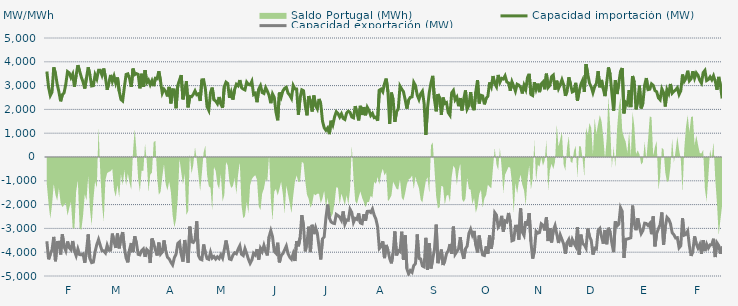
| Category | Capacidad importación (MW) | Capacidad exportación (MW) |
|---|---|---|
| 0 | 3592.5 | -3540 |
| 1900-01-01 | 2925 | -4297.5 |
| 1900-01-02 | 2582.625 | -4080.542 |
| 1900-01-03 | 2730 | -3900.625 |
| 1900-01-04 | 3769.167 | -3357.25 |
| 1900-01-05 | 3498.625 | -4380 |
| 1900-01-06 | 3058.125 | -3591.583 |
| 1900-01-07 | 2735.625 | -3581.875 |
| 1900-01-08 | 2339.792 | -4096.875 |
| 1900-01-09 | 2622.625 | -3250.667 |
| 1900-01-10 | 2697.5 | -3770.625 |
| 1900-01-11 | 3064.167 | -3943.625 |
| 1900-01-12 | 3588.75 | -3549.375 |
| 1900-01-13 | 3535.75 | -3810 |
| 1900-01-14 | 3333.958 | -3898.125 |
| 1900-01-15 | 3486.625 | -3530.542 |
| 1900-01-16 | 2951.375 | -3943.125 |
| 1900-01-17 | 3439.375 | -4149.375 |
| 1900-01-18 | 3860.625 | -3864.375 |
| 1900-01-19 | 3609.583 | -4100.625 |
| 1900-01-20 | 3359.75 | -4110 |
| 1900-01-21 | 3152.25 | -4073.75 |
| 1900-01-22 | 2876.25 | -4441.875 |
| 1900-01-23 | 3331.25 | -3948.75 |
| 1900-01-24 | 3768.75 | -3251.25 |
| 1900-01-25 | 3435.667 | -4269.375 |
| 1900-01-26 | 2984.167 | -4438.125 |
| 1900-01-27 | 2998.583 | -4415.625 |
| 1900-01-28 | 3457.333 | -3980.625 |
| 1900-01-29 | 3283.042 | -3676.875 |
| 1900-01-30 | 3641.25 | -3464.5 |
| 1900-01-31 | 3640.708 | -3708.75 |
| 1900-02-01 | 3435.708 | -3937.5 |
| 1900-02-02 | 3718.125 | -3943.125 |
| 1900-02-03 | 3344.458 | -4031.25 |
| 1900-02-04 | 2827.083 | -3710.625 |
| 1900-02-05 | 3113.75 | -3920.625 |
| 1900-02-06 | 3448.125 | -3913.125 |
| 1900-02-07 | 3172.083 | -3219.375 |
| 1900-02-08 | 3397.5 | -3562.5 |
| 1900-02-09 | 3101.042 | -3819.375 |
| 1900-02-10 | 3341.25 | -3215.625 |
| 1900-02-11 | 2760.833 | -3838.125 |
| 1900-02-12 | 2417.5 | -3395.625 |
| 1900-02-13 | 2354.583 | -3155.625 |
| 1900-02-14 | 2936.875 | -3811.875 |
| 1900-02-15 | 3468.75 | -4241.25 |
| 1900-02-16 | 3495 | -4426.875 |
| 1900-02-17 | 3297.083 | -3890.625 |
| 1900-02-18 | 2946.292 | -3613.125 |
| 1900-02-19 | 3714.792 | -3997.5 |
| 1900-02-20 | 3460.833 | -3331.875 |
| 1900-02-21 | 3502.917 | -3618.5 |
| 1900-02-22 | 3472.5 | -4089.375 |
| 1900-02-23 | 2885.87 | -4111.304 |
| 1900-02-24 | 3496.875 | -3930 |
| 1900-02-25 | 2942.5 | -3858.75 |
| 1900-02-26 | 3650.625 | -4194.375 |
| 1900-02-27 | 3122.458 | -3885 |
| 1900-02-28 | 3230.042 | -3961.875 |
| 1900-02-28 | 3034.208 | -4453.125 |
| 1900-03-01 | 3206.25 | -3423.75 |
| 1900-03-02 | 2977.5 | -3611.25 |
| 1900-03-03 | 3309.375 | -3911.25 |
| 1900-03-04 | 3288.75 | -4138.125 |
| 1900-03-05 | 3602.833 | -3596.25 |
| 1900-03-06 | 3174.375 | -4080 |
| 1900-03-07 | 2683.667 | -3991.875 |
| 1900-03-08 | 2848.875 | -3504.833 |
| 1900-03-09 | 2758.542 | -3938.333 |
| 1900-03-10 | 2545.417 | -4209.375 |
| 1900-03-11 | 2945.625 | -4278.75 |
| 1900-03-12 | 2252.5 | -4423.125 |
| 1900-03-13 | 2829.375 | -4533.75 |
| 1900-03-14 | 2820.917 | -4235.625 |
| 1900-03-15 | 2048.125 | -4081.208 |
| 1900-03-16 | 3003.75 | -3632.292 |
| 1900-03-17 | 3232.5 | -3565.625 |
| 1900-03-18 | 3440.625 | -4096.875 |
| 1900-03-19 | 2422.5 | -4393.125 |
| 1900-03-20 | 2763.958 | -3487.5 |
| 1900-03-21 | 3183.75 | -3943.125 |
| 1900-03-22 | 2087.083 | -4443.75 |
| 1900-03-23 | 2547 | -2925.75 |
| 1900-03-24 | 2531.667 | -3560.625 |
| 1900-03-25 | 2628.75 | -3590.625 |
| 1900-03-26 | 2778.75 | -3480 |
| 1900-03-27 | 2617.292 | -2701.792 |
| 1900-03-28 | 2655 | -4141.875 |
| 1900-03-29 | 2355.417 | -4288.125 |
| 1900-03-30 | 3240.75 | -4318.125 |
| 1900-03-31 | 3247.5 | -3676.875 |
| 1900-04-01 | 2878.042 | -4025.625 |
| 1900-04-02 | 2109.167 | -4269.375 |
| 1900-04-03 | 1961.042 | -4299.375 |
| 1900-04-04 | 2710.208 | -4003.125 |
| 1900-04-05 | 2916 | -4248.333 |
| 1900-04-06 | 2401.875 | -4179.375 |
| 1900-04-07 | 2351.25 | -4286.25 |
| 1900-04-08 | 2238.75 | -4192.5 |
| 1900-04-09 | 2520 | -4265.625 |
| 1900-04-10 | 2227.5 | -4108.125 |
| 1900-04-11 | 2070.583 | -4246.875 |
| 1900-04-12 | 2958.75 | -3892.5 |
| 1900-04-13 | 3146.25 | -3508.125 |
| 1900-04-14 | 3087.5 | -3877.5 |
| 1900-04-15 | 2487.5 | -4284.375 |
| 1900-04-16 | 2722.5 | -4310.625 |
| 1900-04-17 | 2411.25 | -4125 |
| 1900-04-18 | 2840.5 | -4025.625 |
| 1900-04-19 | 3054.5 | -4066.875 |
| 1900-04-20 | 2992.958 | -3879.375 |
| 1900-04-21 | 3232.5 | -3729.375 |
| 1900-04-22 | 2917.5 | -4085.625 |
| 1900-04-23 | 2853.75 | -4141.875 |
| 1900-04-24 | 2819.458 | -3849.375 |
| 1900-04-25 | 3145.042 | -4061.25 |
| 1900-04-26 | 3046.958 | -4290 |
| 1900-04-27 | 3028.125 | -4468.125 |
| 1900-04-28 | 3180.542 | -4331.25 |
| 1900-04-29 | 2624.958 | -4042.5 |
| 1900-04-30 | 2676.25 | -4115.625 |
| 1900-05-01 | 2302.5 | -3873.75 |
| 1900-05-02 | 2854.208 | -4308.75 |
| 1900-05-03 | 2997.833 | -3837.167 |
| 1900-05-04 | 2709.375 | -3973.125 |
| 1900-05-05 | 2670 | -3712.958 |
| 1900-05-06 | 2913.75 | -3958.125 |
| 1900-05-07 | 2765.625 | -4134.375 |
| 1900-05-08 | 2587.5 | -3352.5 |
| 1900-05-09 | 2261.25 | -3093.75 |
| 1900-05-10 | 2651.25 | -3345.208 |
| 1900-05-11 | 2510.625 | -3963.75 |
| 1900-05-12 | 1885.875 | -4044.375 |
| 1900-05-13 | 1541.5 | -3601.375 |
| 1900-05-14 | 2707.5 | -4426.875 |
| 1900-05-15 | 2516.25 | -4128.75 |
| 1900-05-16 | 2775 | -4059.375 |
| 1900-05-17 | 2883.75 | -3906.667 |
| 1900-05-18 | 2930.625 | -3742.5 |
| 1900-05-19 | 2685 | -4061.25 |
| 1900-05-20 | 2596.875 | -4213.125 |
| 1900-05-21 | 2463.75 | -4295.625 |
| 1900-05-22 | 3005.625 | -4065 |
| 1900-05-23 | 2861.25 | -4370.625 |
| 1900-05-24 | 2855.083 | -3533.583 |
| 1900-05-25 | 1775.625 | -3751.875 |
| 1900-05-26 | 2478.75 | -3391.875 |
| 1900-05-27 | 2821.875 | -2444.375 |
| 1900-05-28 | 2782.5 | -2903.75 |
| 1900-05-29 | 2169.375 | -3964.667 |
| 1900-05-30 | 1751.292 | -3614.625 |
| 1900-05-31 | 2561.25 | -2926.875 |
| 1900-06-01 | 2356.875 | -3995.625 |
| 1900-06-02 | 1911.125 | -2849.625 |
| 1900-06-03 | 2583.75 | -3240 |
| 1900-06-04 | 2157.125 | -2962.917 |
| 1900-06-05 | 2021.375 | -3195.625 |
| 1900-06-06 | 2439.375 | -3776.25 |
| 1900-06-07 | 2235 | -4305 |
| 1900-06-08 | 1509.375 | -3436.875 |
| 1900-06-09 | 1230.208 | -3360 |
| 1900-06-10 | 1123.125 | -2546.875 |
| 1900-06-11 | 1221.25 | -1995.875 |
| 1900-06-12 | 962.083 | -2563.125 |
| 1900-06-13 | 1523.958 | -2728.125 |
| 1900-06-14 | 1344.375 | -2776.875 |
| 1900-06-15 | 1676.25 | -2795.625 |
| 1900-06-16 | 1899.375 | -2411.25 |
| 1900-06-17 | 1826.25 | -2461.875 |
| 1900-06-18 | 1680 | -2529.375 |
| 1900-06-19 | 1815 | -2662.5 |
| 1900-06-20 | 1621.458 | -2287.5 |
| 1900-06-21 | 1577.083 | -2818.125 |
| 1900-06-22 | 1846.875 | -2643.75 |
| 1900-06-23 | 1923.75 | -2656.875 |
| 1900-06-24 | 1875 | -2195.625 |
| 1900-06-25 | 1683.75 | -2330.625 |
| 1900-06-26 | 1646.25 | -2746.875 |
| 1900-06-27 | 2137.5 | -2580.5 |
| 1900-06-28 | 1860 | -2620.625 |
| 1900-06-29 | 1537.5 | -2371.875 |
| 1900-06-30 | 2149.292 | -2771.25 |
| 1900-07-01 | 1766.25 | -2801.25 |
| 1900-07-02 | 2097.75 | -2405.625 |
| 1900-07-03 | 1753.125 | -2676.75 |
| 1900-07-04 | 2090.625 | -2285.292 |
| 1900-07-05 | 1956.125 | -2274.75 |
| 1900-07-06 | 1743.75 | -2330.125 |
| 1900-07-07 | 1833.75 | -2185.875 |
| 1900-07-08 | 1651.875 | -2439.375 |
| 1900-07-09 | 1677 | -2608.125 |
| 1900-07-10 | 1526.25 | -2926.875 |
| 1900-07-11 | 2806.875 | -3847.5 |
| 1900-07-12 | 2853.75 | -3770.625 |
| 1900-07-13 | 2739.375 | -3542.5 |
| 1900-07-14 | 3086.25 | -4248.75 |
| 1900-07-15 | 3294.375 | -3694.583 |
| 1900-07-16 | 2737.5 | -3914.167 |
| 1900-07-17 | 1388.958 | -4258.125 |
| 1900-07-18 | 2705.625 | -4468.125 |
| 1900-07-19 | 2414.25 | -4032.292 |
| 1900-07-20 | 1474.5 | -3127.5 |
| 1900-07-21 | 1904.833 | -4134.375 |
| 1900-07-22 | 2018.333 | -3933.75 |
| 1900-07-23 | 2978.625 | -3980.625 |
| 1900-07-24 | 2851.875 | -3137.917 |
| 1900-07-25 | 2745 | -4327.5 |
| 1900-07-26 | 2411.25 | -3294.375 |
| 1900-07-27 | 2032.5 | -4693.125 |
| 1900-07-28 | 2394.375 | -4916.25 |
| 1900-07-29 | 2506.875 | -4770 |
| 1900-07-30 | 2527.5 | -4845 |
| 1900-07-31 | 3132.875 | -4556.25 |
| 1900-08-01 | 3001.875 | -4479.375 |
| 1900-08-02 | 2597 | -3253.75 |
| 1900-08-03 | 2415.833 | -4258.125 |
| 1900-08-04 | 2655 | -4284.375 |
| 1900-08-05 | 2764.458 | -4576.875 |
| 1900-08-06 | 2248.625 | -4616.25 |
| 1900-08-07 | 931.875 | -3396.042 |
| 1900-08-08 | 2074.792 | -4740 |
| 1900-08-09 | 2707.5 | -3624.375 |
| 1900-08-10 | 3118.125 | -4681.875 |
| 1900-08-11 | 3408.75 | -4280.625 |
| 1900-08-12 | 2415 | -3889.583 |
| 1900-08-13 | 1918.917 | -2840.25 |
| 1900-08-14 | 2645.125 | -4460.625 |
| 1900-08-15 | 2469.792 | -4186.875 |
| 1900-08-16 | 1772.542 | -3887.917 |
| 1900-08-17 | 2498.667 | -4538.125 |
| 1900-08-18 | 2245.542 | -4370 |
| 1900-08-19 | 2285.625 | -4056.25 |
| 1900-08-20 | 1862.708 | -3941.667 |
| 1900-08-21 | 1755.417 | -3663.125 |
| 1900-08-22 | 2699.583 | -4063.125 |
| 1900-08-23 | 2797.5 | -2925.625 |
| 1900-08-24 | 2403.333 | -4085.625 |
| 1900-08-25 | 2516.25 | -3971.25 |
| 1900-08-26 | 2135.625 | -3854.792 |
| 1900-08-27 | 2477.125 | -3369.292 |
| 1900-08-28 | 1956.292 | -3999.375 |
| 1900-08-29 | 2427.5 | -4280 |
| 1900-08-30 | 2798 | -3856.875 |
| 1900-08-31 | 2018.125 | -3744.583 |
| 1900-09-01 | 2168.958 | -3208.75 |
| 1900-09-02 | 2728.125 | -3034.375 |
| 1900-09-03 | 2131.75 | -3278.125 |
| 1900-09-04 | 1966.875 | -3106.458 |
| 1900-09-05 | 2738.083 | -3703.375 |
| 1900-09-06 | 3229.167 | -4012.5 |
| 1900-09-07 | 2249.792 | -3300.833 |
| 1900-09-08 | 2592.917 | -3809.792 |
| 1900-09-09 | 2566.25 | -4116.667 |
| 1900-09-10 | 2212.5 | -4138.708 |
| 1900-09-11 | 2464.375 | -3755.833 |
| 1900-09-12 | 2551.042 | -4061.25 |
| 1900-09-13 | 3133.5 | -3295.833 |
| 1900-09-14 | 2953.75 | -3854.167 |
| 1900-09-15 | 3401.25 | -3375.917 |
| 1900-09-16 | 3082.5 | -2336.25 |
| 1900-09-17 | 2949.375 | -2439.375 |
| 1900-09-18 | 3446.25 | -2947.5 |
| 1900-09-19 | 3138.75 | -2840.625 |
| 1900-09-20 | 3305 | -2472.958 |
| 1900-09-21 | 3276.125 | -3134.625 |
| 1900-09-22 | 3410.625 | -2685.417 |
| 1900-09-23 | 3153.75 | -2727.292 |
| 1900-09-24 | 3110.625 | -2351.25 |
| 1900-09-25 | 2786.458 | -2737.5 |
| 1900-09-26 | 3159.375 | -3519.375 |
| 1900-09-27 | 2974.6 | -3488.4 |
| 1900-09-28 | 2766.667 | -2906.917 |
| 1900-09-29 | 3058.125 | -2902.5 |
| 1900-09-30 | 3018.75 | -3474.375 |
| 1900-10-01 | 2925.625 | -2158.375 |
| 1900-10-02 | 2670.667 | -3157.5 |
| 1900-10-03 | 3015 | -3296.25 |
| 1900-10-04 | 2835.25 | -2693.125 |
| 1900-10-05 | 3337.5 | -2882.083 |
| 1900-10-06 | 3493.125 | -2358.75 |
| 1900-10-07 | 2626.042 | -3555 |
| 1900-10-08 | 2583.542 | -4267.5 |
| 1900-10-09 | 3140.625 | -3948.75 |
| 1900-10-10 | 2844.375 | -3122.5 |
| 1900-10-11 | 3082.5 | -3200.625 |
| 1900-10-12 | 2726.25 | -3170.625 |
| 1900-10-13 | 3071.25 | -2806.875 |
| 1900-10-14 | 3151.875 | -2865 |
| 1900-10-15 | 2845.417 | -3084.375 |
| 1900-10-16 | 3500.625 | -2536.875 |
| 1900-10-17 | 2921.75 | -3531.625 |
| 1900-10-18 | 3012.625 | -2985.75 |
| 1900-10-19 | 3378.75 | -3590.625 |
| 1900-10-20 | 3442.5 | -3078.75 |
| 1900-10-21 | 2829.167 | -2881.042 |
| 1900-10-22 | 3205.833 | -3234.375 |
| 1900-10-23 | 2873.625 | -3613.125 |
| 1900-10-24 | 3038.333 | -3270 |
| 1900-10-25 | 3245.625 | -3459.375 |
| 1900-10-26 | 3029.167 | -3656.25 |
| 1900-10-27 | 2571.042 | -4057.5 |
| 1900-10-28 | 2766.125 | -3596.417 |
| 1900-10-29 | 3348.75 | -3465 |
| 1900-10-30 | 3046.333 | -3774.375 |
| 1900-10-31 | 2732.708 | -3460.042 |
| 1900-11-01 | 2770.75 | -3616.875 |
| 1900-11-02 | 3116.25 | -3757.75 |
| 1900-11-03 | 2370.5 | -2949.375 |
| 1900-11-04 | 2758.625 | -4102.5 |
| 1900-11-05 | 3054.167 | -3262.5 |
| 1900-11-06 | 3221.875 | -3637.5 |
| 1900-11-07 | 2734.792 | -3695.625 |
| 1900-11-08 | 3901.875 | -3830.625 |
| 1900-11-09 | 3478.125 | -3007.5 |
| 1900-11-10 | 3100.208 | -3343.125 |
| 1900-11-11 | 2951.458 | -3500.625 |
| 1900-11-12 | 2703.125 | -4100.625 |
| 1900-11-13 | 2949.667 | -3832.5 |
| 1900-11-14 | 3092.292 | -3864.375 |
| 1900-11-15 | 3609.375 | -3088.125 |
| 1900-11-16 | 2928.75 | -3003.75 |
| 1900-11-17 | 3238.333 | -3346.875 |
| 1900-11-18 | 2865.417 | -3639.375 |
| 1900-11-19 | 2557.917 | -3067.5 |
| 1900-11-20 | 3131.667 | -3665.625 |
| 1900-11-21 | 3761.25 | -2973.625 |
| 1900-11-22 | 3468.542 | -3153.75 |
| 1900-11-23 | 2673.75 | -3622.5 |
| 1900-11-24 | 1945.625 | -3999.375 |
| 1900-11-25 | 3222.083 | -2703.875 |
| 1900-11-26 | 2645.458 | -2900.625 |
| 1900-11-27 | 3097.5 | -2827.5 |
| 1900-11-28 | 3595.208 | -2128.75 |
| 1900-11-29 | 3741.458 | -2283.75 |
| 1900-11-30 | 1833.125 | -4242.5 |
| 1900-12-01 | 2294.25 | -3457.125 |
| 1900-12-02 | 2210.833 | -3444.375 |
| 1900-12-03 | 2808.75 | -3420 |
| 1900-12-04 | 2098.083 | -3391.875 |
| 1900-12-05 | 3404.792 | -2041.875 |
| 1900-12-06 | 3136.875 | -2790.292 |
| 1900-12-07 | 2001.25 | -3075.75 |
| 1900-12-08 | 2334.583 | -2570.625 |
| 1900-12-09 | 2998.542 | -2932.5 |
| 1900-12-10 | 2041.583 | -3219.375 |
| 1900-12-11 | 2261.875 | -3091.875 |
| 1900-12-12 | 3017.292 | -2780.625 |
| 1900-12-13 | 3316.667 | -2796 |
| 1900-12-14 | 2831.875 | -2880.375 |
| 1900-12-15 | 2848.875 | -2791.375 |
| 1900-12-16 | 3072.083 | -3242.5 |
| 1900-12-17 | 3008.75 | -2494.125 |
| 1900-12-18 | 2789.75 | -3753.75 |
| 1900-12-19 | 2740.75 | -3208.125 |
| 1900-12-20 | 2484.167 | -3015 |
| 1900-12-21 | 2405.083 | -2845.208 |
| 1900-12-22 | 2862.542 | -2330.625 |
| 1900-12-23 | 2704.875 | -3693.75 |
| 1900-12-24 | 2121.458 | -2932.25 |
| 1900-12-25 | 2826.875 | -2536.458 |
| 1900-12-26 | 2666.25 | -2617.875 |
| 1900-12-27 | 3068.375 | -2797.625 |
| 1900-12-28 | 2681.458 | -3181.875 |
| 1900-12-29 | 2762.167 | -3268.125 |
| 1900-12-30 | 2816.458 | -3403.125 |
| 1900-12-31 | 2908.75 | -3388.125 |
| 1901-01-01 | 2628.458 | -3817.5 |
| 1901-01-02 | 2784.5 | -3729.375 |
| 1901-01-03 | 3466.875 | -2575.375 |
| 1901-01-04 | 3180 | -3284.375 |
| 1901-01-05 | 3301.25 | -3251.25 |
| 1901-01-06 | 3624.375 | -3114.375 |
| 1901-01-07 | 3203.333 | -3733.125 |
| 1901-01-08 | 3288.125 | -4155 |
| 1901-01-09 | 3606.25 | -3943.125 |
| 1901-01-10 | 3313.75 | -3335.625 |
| 1901-01-11 | 3531.417 | -3646.875 |
| 1901-01-12 | 3433.125 | -3826.875 |
| 1901-01-13 | 3223.542 | -3673.333 |
| 1901-01-14 | 3103.75 | -4066.875 |
| 1901-01-15 | 3546.25 | -3496.875 |
| 1901-01-16 | 3638.5 | -3952.5 |
| 1901-01-17 | 3210 | -3661.875 |
| 1901-01-18 | 3255.417 | -3826.875 |
| 1901-01-19 | 3367.5 | -3690 |
| 1901-01-20 | 3244.5 | -3684.375 |
| 1901-01-21 | 3411.458 | -3435 |
| 1901-01-22 | 3192.708 | -4203.75 |
| 1901-01-23 | 2825 | -3605.625 |
| 1901-01-24 | 3365.667 | -3718.625 |
| 1901-01-25 | 3014.375 | -4063.125 |
| 1901-01-26 | 2458.292 | -3762 |